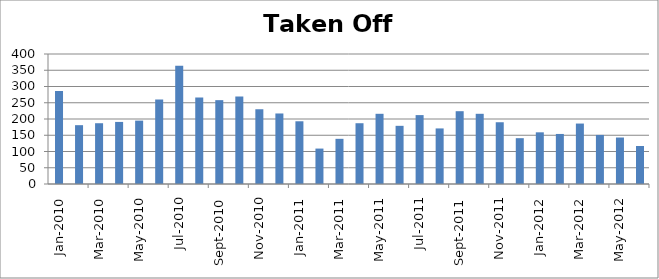
| Category | Series 0 |
|---|---|
| 2010-01-01 | 286 |
| 2010-02-01 | 181 |
| 2010-03-01 | 187 |
| 2010-04-01 | 191 |
| 2010-05-01 | 195 |
| 2010-06-01 | 260 |
| 2010-07-01 | 364 |
| 2010-08-01 | 266 |
| 2010-09-01 | 258 |
| 2010-10-01 | 269 |
| 2010-11-01 | 230 |
| 2010-12-01 | 217 |
| 2011-01-01 | 193 |
| 2011-02-01 | 109 |
| 2011-03-01 | 139 |
| 2011-04-01 | 187 |
| 2011-05-01 | 216 |
| 2011-06-01 | 179 |
| 2011-07-01 | 212 |
| 2011-08-01 | 171 |
| 2011-09-01 | 224 |
| 2011-10-01 | 216 |
| 2011-11-01 | 190 |
| 2011-12-01 | 141 |
| 2012-01-01 | 159 |
| 2012-02-01 | 154 |
| 2012-03-01 | 186 |
| 2012-04-01 | 151 |
| 2012-05-01 | 143 |
| 2012-06-01 | 117 |